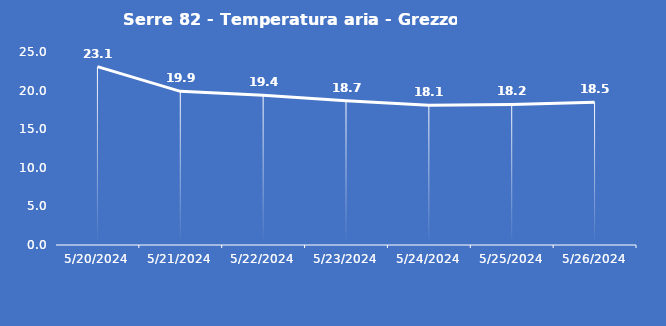
| Category | Serre 82 - Temperatura aria - Grezzo (°C) |
|---|---|
| 5/20/24 | 23.1 |
| 5/21/24 | 19.9 |
| 5/22/24 | 19.4 |
| 5/23/24 | 18.7 |
| 5/24/24 | 18.1 |
| 5/25/24 | 18.2 |
| 5/26/24 | 18.5 |